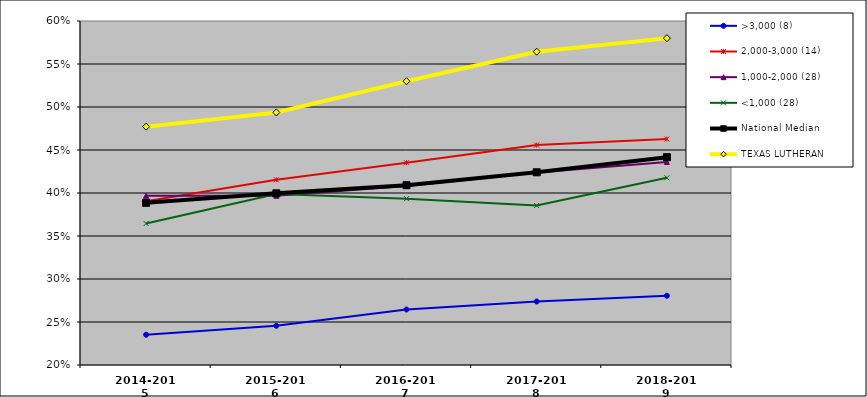
| Category | >3,000 (8) | 2,000-3,000 (14) | 1,000-2,000 (28) | <1,000 (28) | National Median | TEXAS LUTHERAN |
|---|---|---|---|---|---|---|
| 2014-2015 | 0.235 | 0.391 | 0.397 | 0.365 | 0.389 | 0.477 |
| 2015-2016 | 0.246 | 0.415 | 0.397 | 0.399 | 0.4 | 0.494 |
| 2016-2017 | 0.265 | 0.435 | 0.408 | 0.393 | 0.409 | 0.53 |
| 2017-2018 | 0.274 | 0.456 | 0.424 | 0.385 | 0.424 | 0.564 |
| 2018-2019 | 0.281 | 0.463 | 0.436 | 0.418 | 0.442 | 0.58 |